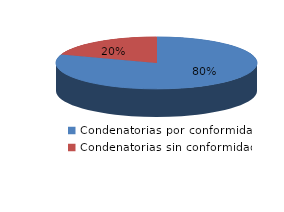
| Category | Series 0 |
|---|---|
| 0 | 110 |
| 1 | 27 |